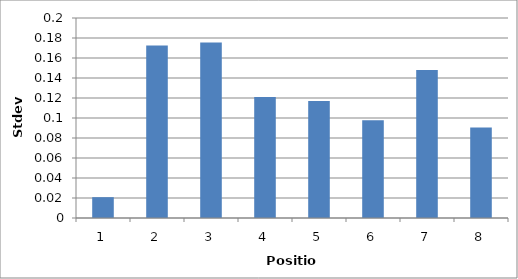
| Category | Stdev |
|---|---|
| 0 | 0.021 |
| 1 | 0.172 |
| 2 | 0.176 |
| 3 | 0.121 |
| 4 | 0.117 |
| 5 | 0.098 |
| 6 | 0.148 |
| 7 | 0.09 |